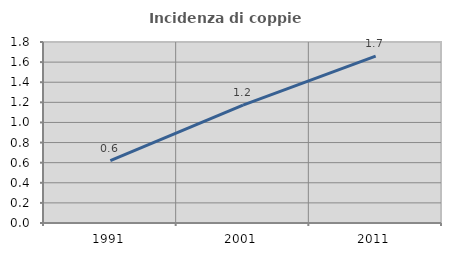
| Category | Incidenza di coppie miste |
|---|---|
| 1991.0 | 0.621 |
| 2001.0 | 1.172 |
| 2011.0 | 1.659 |